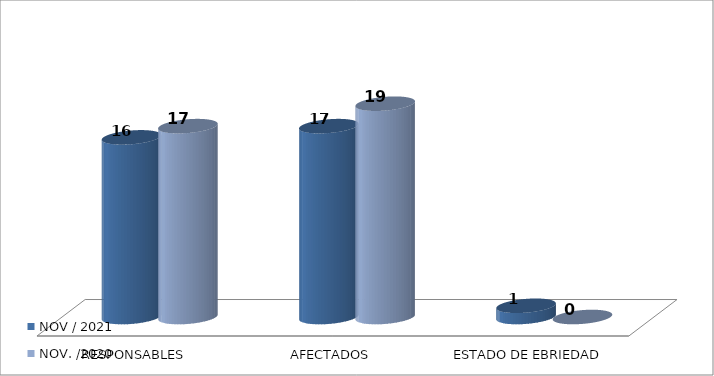
| Category | NOV / 2021 | NOV. /2020 |
|---|---|---|
| RESPONSABLES | 16 | 17 |
| AFECTADOS | 17 | 19 |
| ESTADO DE EBRIEDAD | 1 | 0 |